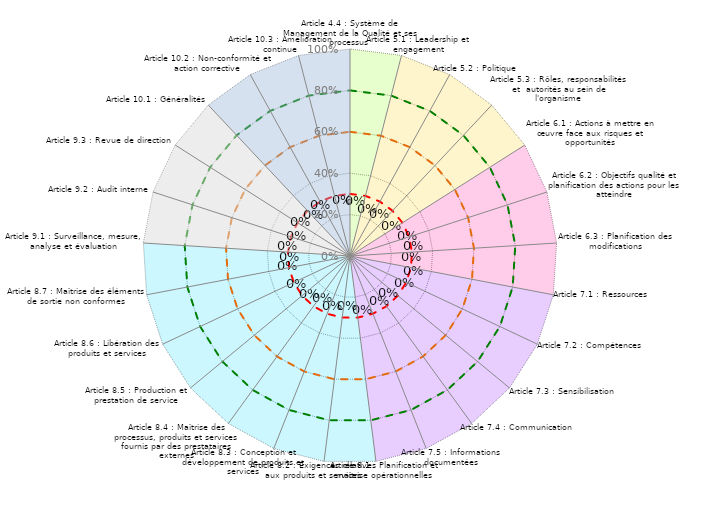
| Category | Coloriage Art 4 | Coloriage Art 5 | Coloriage Art  6 | Coloriage Art 7 | Coloriage Art 8 | Conforme | Informel | Convaincant | Art 9 | Art 10 | Résultats des sous articles |
|---|---|---|---|---|---|---|---|---|---|---|---|
| Article 4.4 : Système de Management de la Qualité et ses processus | 1 | 0 | 0 | 0 | 0 | 0.8 | 0.3 | 0.6 | 0 | 1 | 0 |
| Article 5.1 : Leadership et engagement | 1 | 1 | 0 | 0 | 0 | 0.8 | 0.3 | 0.6 | 0 | 0 | 0 |
| Article 5.2 : Politique | 0 | 1 | 0 | 0 | 0 | 0.8 | 0.3 | 0.6 | 0 | 0 | 0 |
| Article 5.3 : Rôles, responsabilités et  autorités au sein de l'organisme | 0 | 1 | 0 | 0 | 0 | 0.8 | 0.3 | 0.6 | 0 | 0 | 0 |
| Article 6.1 : Actions à mettre en œuvre face aux risques et opportunités | 0 | 1 | 1 | 0 | 0 | 0.8 | 0.3 | 0.6 | 0 | 0 | 0 |
| Article 6.2 : Objectifs qualité et planification des actions pour les atteindre | 0 | 0 | 1 | 0 | 0 | 0.8 | 0.3 | 0.6 | 0 | 0 | 0 |
| Article 6.3 : Planification des modifications | 0 | 0 | 1 | 0 | 0 | 0.8 | 0.3 | 0.6 | 0 | 0 | 0 |
| Article 7.1 : Ressources | 0 | 0 | 1 | 1 | 0 | 0.8 | 0.3 | 0.6 | 0 | 0 | 0 |
| Article 7.2 : Compétences | 0 | 0 | 0 | 1 | 0 | 0.8 | 0.3 | 0.6 | 0 | 0 | 0 |
| Article 7.3 : Sensibilisation | 0 | 0 | 0 | 1 | 0 | 0.8 | 0.3 | 0.6 | 0 | 0 | 0 |
| Article 7.4 : Communication | 0 | 0 | 0 | 1 | 0 | 0.8 | 0.3 | 0.6 | 0 | 0 | 0 |
| Article 7.5 : Informations documentées | 0 | 0 | 0 | 1 | 0 | 0.8 | 0.3 | 0.6 | 0 | 0 | 0 |
| Article 8.1 : Planification et maîtrise opérationnelles | 0 | 0 | 0 | 1 | 1 | 0.8 | 0.3 | 0.6 | 0 | 0 | 0 |
| Article 8.2 : Exigences relatives aux produits et services | 0 | 0 | 0 | 0 | 1 | 0.8 | 0.3 | 0.6 | 0 | 0 | 0 |
| Article 8.3 : Conception et développement de produits et services | 0 | 0 | 0 | 0 | 1 | 0.8 | 0.3 | 0.6 | 0 | 0 | 0 |
| Article 8.4 : Maîtrise des processus, produits et services fournis par des prestataires externes | 0 | 0 | 0 | 0 | 1 | 0.8 | 0.3 | 0.6 | 0 | 0 | 0 |
| Article 8.5 : Production et prestation de service | 0 | 0 | 0 | 0 | 1 | 0.8 | 0.3 | 0.6 | 0 | 0 | 0 |
| Article 8.6 : Libération des produits et services | 0 | 0 | 0 | 0 | 1 | 0.8 | 0.3 | 0.6 | 0 | 0 | 0 |
| Article 8.7 : Maîtrise des éléments de sortie non conformes | 0 | 0 | 0 | 0 | 1 | 0.8 | 0.3 | 0.6 | 0 | 0 | 0 |
| Article 9.1 : Surveillance, mesure, analyse et évaluation | 0 | 0 | 0 | 0 | 1 | 0.8 | 0.3 | 0.6 | 1 | 0 | 0 |
| Article 9.2 : Audit interne | 0 | 0 | 0 | 0 | 0 | 0.8 | 0.3 | 0.6 | 1 | 0 | 0 |
| Article 9.3 : Revue de direction | 0 | 0 | 0 | 0 | 0 | 0.8 | 0.3 | 0.6 | 1 | 0 | 0 |
| Article 10.1 : Généralités | 0 | 0 | 0 | 0 | 0 | 0.8 | 0.3 | 0.6 | 1 | 1 | 0 |
| Article 10.2 : Non-conformité et action corrective | 0 | 0 | 0 | 0 | 0 | 0.8 | 0.3 | 0.6 | 0 | 1 | 0 |
| Article 10.3 : Amélioration continue | 0 | 0 | 0 | 0 | 0 | 0.8 | 0.3 | 0.6 | 0 | 1 | 0 |